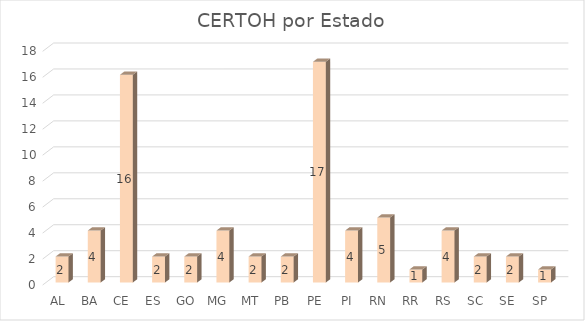
| Category | CERTOH por Estado |
|---|---|
| AL | 2 |
| BA | 4 |
| CE | 16 |
| ES | 2 |
| GO | 2 |
| MG | 4 |
| MT | 2 |
| PB | 2 |
| PE | 17 |
| PI | 4 |
| RN | 5 |
| RR | 1 |
| RS | 4 |
| SC | 2 |
| SE | 2 |
| SP | 1 |